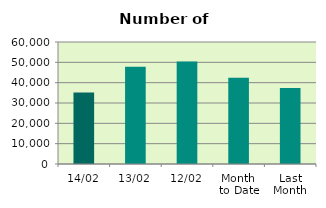
| Category | Series 0 |
|---|---|
| 14/02 | 35174 |
| 13/02 | 47788 |
| 12/02 | 50464 |
| Month 
to Date | 42433 |
| Last
Month | 37374.818 |